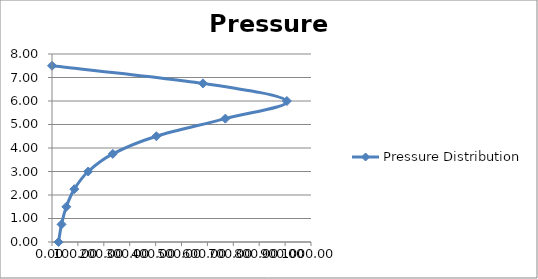
| Category | Pressure Distribution |
|---|---|
| 0.0 | 7.5 |
| 582.8569137081415 | 6.75 |
| 906.9649920000002 | 6 |
| 669.3743021854116 | 5.25 |
| 403.1442876649976 | 4.5 |
| 234.84267201887647 | 3.75 |
| 139.74550797492637 | 3 |
| 86.26854600354659 | 2.25 |
| 55.35674999999997 | 1.5 |
| 36.82951414004428 | 0.75 |
| 25.31042461018633 | 0 |